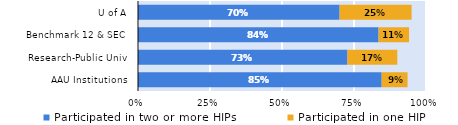
| Category | Participated in two or more HIPs | Participated in one HIP |
|---|---|---|
| AAU Institutions | 0.846 | 0.09 |
| Research-Public Univ | 0.727 | 0.173 |
| Benchmark 12 & SEC | 0.835 | 0.106 |
| U of A | 0.7 | 0.25 |